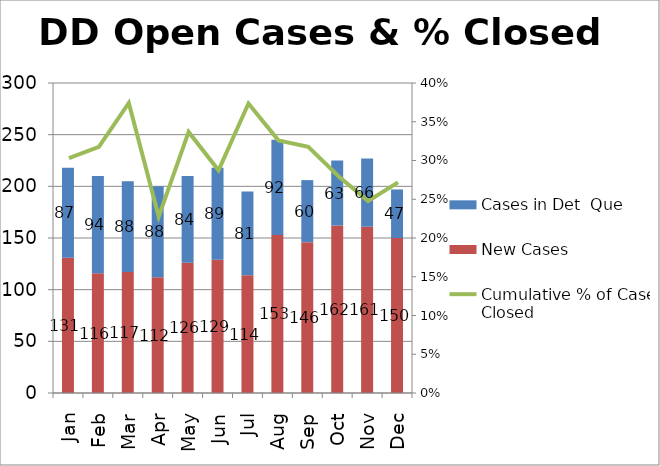
| Category | New Cases | Cases in Det  Que |
|---|---|---|
| Jan | 131 | 87 |
| Feb | 116 | 94 |
| Mar | 117 | 88 |
| Apr | 112 | 88 |
| May | 126 | 84 |
| Jun | 129 | 89 |
| Jul | 114 | 81 |
| Aug | 153 | 92 |
| Sep | 146 | 60 |
| Oct | 162 | 63 |
| Nov | 161 | 66 |
| Dec | 150 | 47 |